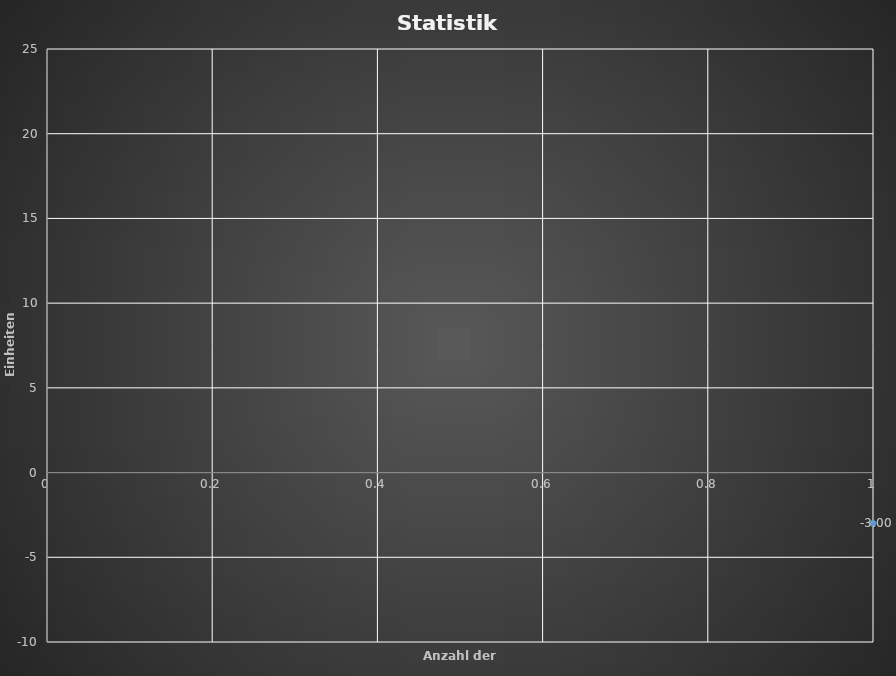
| Category | Series 0 |
|---|---|
| 0 | -3 |
| 1 | -4.5 |
| 2 | -1.8 |
| 3 | 1.23 |
| 4 | 3.169 |
| 5 | 4.256 |
| 6 | 5.857 |
| 7 | 3.857 |
| 8 | 8.116 |
| 9 | 10.227 |
| 10 | 8.227 |
| 11 | 9.577 |
| 12 | 8.577 |
| 13 | 10.417 |
| 14 | 8.417 |
| 15 | 9.625 |
| 16 | 11.14 |
| 17 | 9.64 |
| 18 | 9.64 |
| 19 | 8.14 |
| 20 | 7.14 |
| 21 | 7.09 |
| 22 | 5.09 |
| 23 | 1.09 |
| 24 | 3.715 |
| 25 | 5.23 |
| 26 | 7.08 |
| 27 | 8.832 |
| 28 | 9.865 |
| 29 | 7.865 |
| 30 | 5.865 |
| 31 | 7.465 |
| 32 | 8.318 |
| 33 | 7.318 |
| 34 | 9.194 |
| 35 | 10.614 |
| 36 | 13.164 |
| 37 | 11.164 |
| 38 | 10.664 |
| 39 | 12.879 |
| 40 | 13.804 |
| 41 | 16.137 |
| 42 | 17.132 |
| 43 | 19.038 |
| 44 | 16.038 |
| 45 | 17.098 |
| 46 | 16.098 |
| 47 | 15.098 |
| 48 | 13.098 |
| 49 | 14.188 |
| 50 | 12.688 |
| 51 | 11.938 |
| 52 | 12.738 |
| 53 | 13.532 |
| 54 | 13.432 |
| 55 | 14.355 |
| 56 | 15.775 |
| 57 | 17.48 |
| 58 | 14.48 |
| 59 | 13.48 |
| 60 | 12.48 |
| 61 | 10.48 |
| 62 | 8.98 |
| 63 | 6.98 |
| 64 | 0.98 |
| 65 | 2.355 |
| 66 | 0.855 |
| 67 | -0.145 |
| 68 | -2.145 |
| 69 | -3.645 |
| 70 | -2.65 |
| 71 | -2.06 |
| 72 | -1.388 |
| 73 | -0.422 |
| 74 | 0.763 |
| 75 | -1.737 |
| 76 | -1.912 |
| 77 | -0.774 |
| 78 | -1.774 |
| 79 | -0.164 |
| 80 | -1.164 |
| 81 | -2.664 |
| 82 | -0.879 |
| 83 | 1.323 |
| 84 | -1.677 |
| 85 | -3.177 |
| 86 | -2.177 |
| 87 | -3.177 |
| 88 | -4.177 |
| 89 | -2.047 |
| 90 | -2.647 |
| 91 | -2.697 |
| 92 | -3.697 |
| 93 | -1.365 |
| 94 | 0.285 |
| 95 | 1.785 |
| 96 | 2.685 |
| 97 | -0.315 |
| 98 | -1.815 |
| 99 | -1.065 |
| 100 | -3.065 |
| 101 | -1.615 |
| 102 | 1.163 |
| 103 | -0.837 |
| 104 | 1.413 |
| 105 | 2.39 |
| 106 | 1.89 |
| 107 | 4.29 |
| 108 | 3.29 |